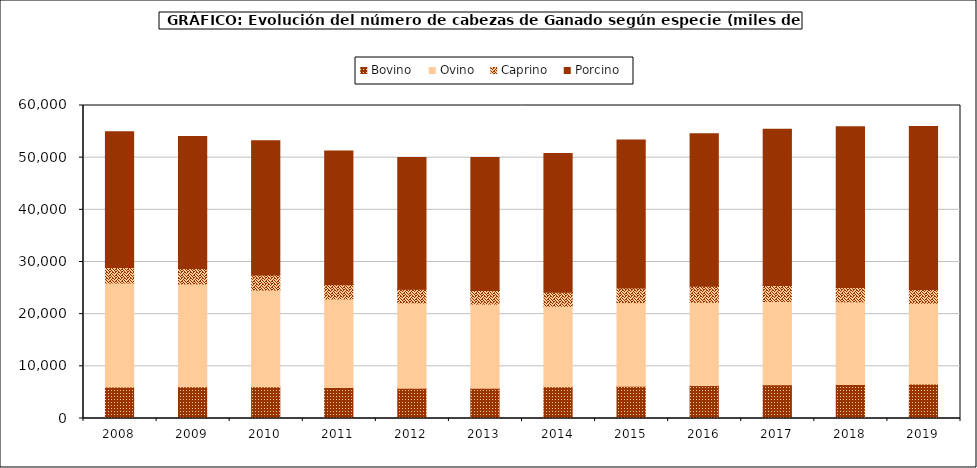
| Category | Bovino | Ovino | Caprino | Porcino |
|---|---|---|---|---|
| 2008.0 | 6020 | 19952.282 | 2959.329 | 26025.672 |
| 2009.0 | 6082.442 | 19718.195 | 2933.782 | 25342.606 |
| 2010.0 | 6075 | 18552 | 2904 | 25704 |
| 2011.0 | 5923 | 17003 | 2693 | 25635 |
| 2012.0 | 5812.605 | 16339.373 | 2637.336 | 25250.377 |
| 2013.0 | 5802.22 | 16118.586 | 2609.989 | 25494.715 |
| 2014.0 | 6078.733 | 15431.804 | 2704.228 | 26567.578 |
| 2015.0 | 6182.908 | 16026.374 | 2801.064 | 28367.335 |
| 2016.0 | 6317.641 | 15962.892 | 3088.035 | 29231.595 |
| 2017.0 | 6465.747 | 15963.106 | 3059.731 | 29971.357 |
| 2018.0 | 6510.592 | 15852.525 | 2764.79 | 30804.102 |
| 2019.0 | 6600 | 15478 | 2659 | 31246 |